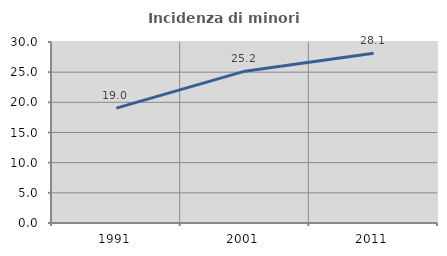
| Category | Incidenza di minori stranieri |
|---|---|
| 1991.0 | 19.048 |
| 2001.0 | 25.17 |
| 2011.0 | 28.117 |